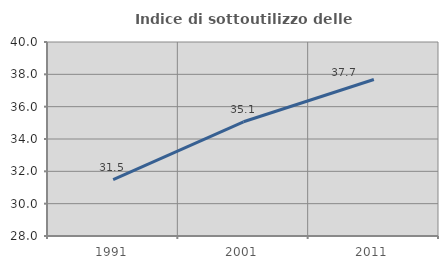
| Category | Indice di sottoutilizzo delle abitazioni  |
|---|---|
| 1991.0 | 31.489 |
| 2001.0 | 35.065 |
| 2011.0 | 37.681 |